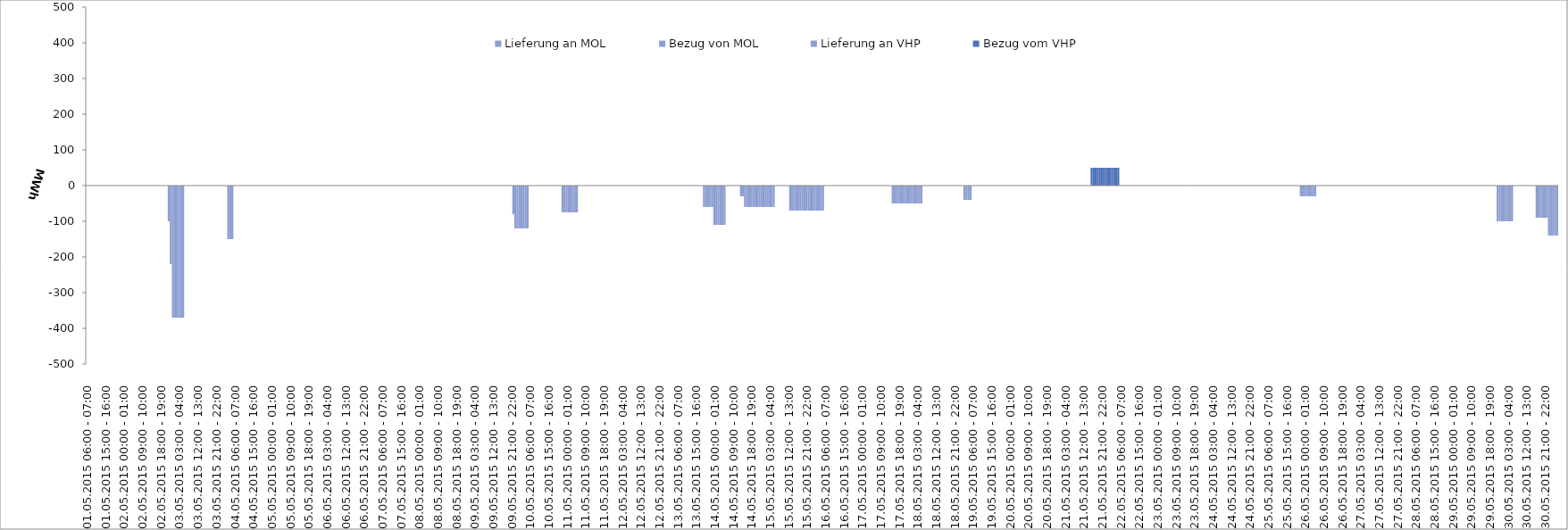
| Category | Bezug vom VHP | Lieferung an VHP | Bezug von MOL | Lieferung an MOL |
|---|---|---|---|---|
| 01.05.2015 06:00 - 07:00 | 0 | 0 | 0 | 0 |
| 01.05.2015 07:00 - 08:00 | 0 | 0 | 0 | 0 |
| 01.05.2015 08:00 - 09:00 | 0 | 0 | 0 | 0 |
| 01.05.2015 09:00 - 10:00 | 0 | 0 | 0 | 0 |
| 01.05.2015 10:00 - 11:00 | 0 | 0 | 0 | 0 |
| 01.05.2015 11:00 - 12:00 | 0 | 0 | 0 | 0 |
| 01.05.2015 12:00 - 13:00 | 0 | 0 | 0 | 0 |
| 01.05.2015 13:00 - 14:00 | 0 | 0 | 0 | 0 |
| 01.05.2015 14:00 - 15:00 | 0 | 0 | 0 | 0 |
| 01.05.2015 15:00 - 16:00 | 0 | 0 | 0 | 0 |
| 01.05.2015 16:00 - 17:00 | 0 | 0 | 0 | 0 |
| 01.05.2015 17:00 - 18:00 | 0 | 0 | 0 | 0 |
| 01.05.2015 18:00 - 19:00 | 0 | 0 | 0 | 0 |
| 01.05.2015 19:00 - 20:00 | 0 | 0 | 0 | 0 |
| 01.05.2015 20:00 - 21:00 | 0 | 0 | 0 | 0 |
| 01.05.2015 21:00 - 22:00 | 0 | 0 | 0 | 0 |
| 01.05.2015 22:00 - 23:00 | 0 | 0 | 0 | 0 |
| 01.05.2015 23:00 - 24:00 | 0 | 0 | 0 | 0 |
| 02.05.2015 00:00 - 01:00 | 0 | 0 | 0 | 0 |
| 02.05.2015 01:00 - 02:00 | 0 | 0 | 0 | 0 |
| 02.05.2015 02:00 - 03:00 | 0 | 0 | 0 | 0 |
| 02.05.2015 03:00 - 04:00 | 0 | 0 | 0 | 0 |
| 02.05.2015 04:00 - 05:00 | 0 | 0 | 0 | 0 |
| 02.05.2015 05:00 - 06:00 | 0 | 0 | 0 | 0 |
| 02.05.2015 06:00 - 07:00 | 0 | 0 | 0 | 0 |
| 02.05.2015 07:00 - 08:00 | 0 | 0 | 0 | 0 |
| 02.05.2015 08:00 - 09:00 | 0 | 0 | 0 | 0 |
| 02.05.2015 09:00 - 10:00 | 0 | 0 | 0 | 0 |
| 02.05.2015 10:00 - 11:00 | 0 | 0 | 0 | 0 |
| 02.05.2015 11:00 - 12:00 | 0 | 0 | 0 | 0 |
| 02.05.2015 12:00 - 13:00 | 0 | 0 | 0 | 0 |
| 02.05.2015 13:00 - 14:00 | 0 | 0 | 0 | 0 |
| 02.05.2015 14:00 - 15:00 | 0 | 0 | 0 | 0 |
| 02.05.2015 15:00 - 16:00 | 0 | 0 | 0 | 0 |
| 02.05.2015 16:00 - 17:00 | 0 | 0 | 0 | 0 |
| 02.05.2015 17:00 - 18:00 | 0 | 0 | 0 | 0 |
| 02.05.2015 18:00 - 19:00 | 0 | 0 | 0 | 0 |
| 02.05.2015 19:00 - 20:00 | 0 | 0 | 0 | 0 |
| 02.05.2015 20:00 - 21:00 | 0 | 0 | 0 | 0 |
| 02.05.2015 21:00 - 22:00 | 0 | 0 | 0 | 0 |
| 02.05.2015 22:00 - 23:00 | 0 | -100 | 0 | 0 |
| 02.05.2015 23:00 - 24:00 | 0 | -220 | 0 | 0 |
| 03.05.2015 00:00 - 01:00 | 0 | -370 | 0 | 0 |
| 03.05.2015 01:00 - 02:00 | 0 | -370 | 0 | 0 |
| 03.05.2015 02:00 - 03:00 | 0 | -370 | 0 | 0 |
| 03.05.2015 03:00 - 04:00 | 0 | -370 | 0 | 0 |
| 03.05.2015 04:00 - 05:00 | 0 | -370 | 0 | 0 |
| 03.05.2015 05:00 - 06:00 | 0 | -370 | 0 | 0 |
| 03.05.2015 06:00 - 07:00 | 0 | 0 | 0 | 0 |
| 03.05.2015 07:00 - 08:00 | 0 | 0 | 0 | 0 |
| 03.05.2015 08:00 - 09:00 | 0 | 0 | 0 | 0 |
| 03.05.2015 09:00 - 10:00 | 0 | 0 | 0 | 0 |
| 03.05.2015 10:00 - 11:00 | 0 | 0 | 0 | 0 |
| 03.05.2015 11:00 - 12:00 | 0 | 0 | 0 | 0 |
| 03.05.2015 12:00 - 13:00 | 0 | 0 | 0 | 0 |
| 03.05.2015 13:00 - 14:00 | 0 | 0 | 0 | 0 |
| 03.05.2015 14:00 - 15:00 | 0 | 0 | 0 | 0 |
| 03.05.2015 15:00 - 16:00 | 0 | 0 | 0 | 0 |
| 03.05.2015 16:00 - 17:00 | 0 | 0 | 0 | 0 |
| 03.05.2015 17:00 - 18:00 | 0 | 0 | 0 | 0 |
| 03.05.2015 18:00 - 19:00 | 0 | 0 | 0 | 0 |
| 03.05.2015 19:00 - 20:00 | 0 | 0 | 0 | 0 |
| 03.05.2015 20:00 - 21:00 | 0 | 0 | 0 | 0 |
| 03.05.2015 21:00 - 22:00 | 0 | 0 | 0 | 0 |
| 03.05.2015 22:00 - 23:00 | 0 | 0 | 0 | 0 |
| 03.05.2015 23:00 - 24:00 | 0 | 0 | 0 | 0 |
| 04.05.2015 00:00 - 01:00 | 0 | 0 | 0 | 0 |
| 04.05.2015 01:00 - 02:00 | 0 | 0 | 0 | 0 |
| 04.05.2015 02:00 - 03:00 | 0 | 0 | 0 | 0 |
| 04.05.2015 03:00 - 04:00 | 0 | -150 | 0 | 0 |
| 04.05.2015 04:00 - 05:00 | 0 | -150 | 0 | 0 |
| 04.05.2015 05:00 - 06:00 | 0 | -150 | 0 | 0 |
| 04.05.2015 06:00 - 07:00 | 0 | 0 | 0 | 0 |
| 04.05.2015 07:00 - 08:00 | 0 | 0 | 0 | 0 |
| 04.05.2015 08:00 - 09:00 | 0 | 0 | 0 | 0 |
| 04.05.2015 09:00 - 10:00 | 0 | 0 | 0 | 0 |
| 04.05.2015 10:00 - 11:00 | 0 | 0 | 0 | 0 |
| 04.05.2015 11:00 - 12:00 | 0 | 0 | 0 | 0 |
| 04.05.2015 12:00 - 13:00 | 0 | 0 | 0 | 0 |
| 04.05.2015 13:00 - 14:00 | 0 | 0 | 0 | 0 |
| 04.05.2015 14:00 - 15:00 | 0 | 0 | 0 | 0 |
| 04.05.2015 15:00 - 16:00 | 0 | 0 | 0 | 0 |
| 04.05.2015 16:00 - 17:00 | 0 | 0 | 0 | 0 |
| 04.05.2015 17:00 - 18:00 | 0 | 0 | 0 | 0 |
| 04.05.2015 18:00 - 19:00 | 0 | 0 | 0 | 0 |
| 04.05.2015 19:00 - 20:00 | 0 | 0 | 0 | 0 |
| 04.05.2015 20:00 - 21:00 | 0 | 0 | 0 | 0 |
| 04.05.2015 21:00 - 22:00 | 0 | 0 | 0 | 0 |
| 04.05.2015 22:00 - 23:00 | 0 | 0 | 0 | 0 |
| 04.05.2015 23:00 - 24:00 | 0 | 0 | 0 | 0 |
| 05.05.2015 00:00 - 01:00 | 0 | 0 | 0 | 0 |
| 05.05.2015 01:00 - 02:00 | 0 | 0 | 0 | 0 |
| 05.05.2015 02:00 - 03:00 | 0 | 0 | 0 | 0 |
| 05.05.2015 03:00 - 04:00 | 0 | 0 | 0 | 0 |
| 05.05.2015 04:00 - 05:00 | 0 | 0 | 0 | 0 |
| 05.05.2015 05:00 - 06:00 | 0 | 0 | 0 | 0 |
| 05.05.2015 06:00 - 07:00 | 0 | 0 | 0 | 0 |
| 05.05.2015 07:00 - 08:00 | 0 | 0 | 0 | 0 |
| 05.05.2015 08:00 - 09:00 | 0 | 0 | 0 | 0 |
| 05.05.2015 09:00 - 10:00 | 0 | 0 | 0 | 0 |
| 05.05.2015 10:00 - 11:00 | 0 | 0 | 0 | 0 |
| 05.05.2015 11:00 - 12:00 | 0 | 0 | 0 | 0 |
| 05.05.2015 12:00 - 13:00 | 0 | 0 | 0 | 0 |
| 05.05.2015 13:00 - 14:00 | 0 | 0 | 0 | 0 |
| 05.05.2015 14:00 - 15:00 | 0 | 0 | 0 | 0 |
| 05.05.2015 15:00 - 16:00 | 0 | 0 | 0 | 0 |
| 05.05.2015 16:00 - 17:00 | 0 | 0 | 0 | 0 |
| 05.05.2015 17:00 - 18:00 | 0 | 0 | 0 | 0 |
| 05.05.2015 18:00 - 19:00 | 0 | 0 | 0 | 0 |
| 05.05.2015 19:00 - 20:00 | 0 | 0 | 0 | 0 |
| 05.05.2015 20:00 - 21:00 | 0 | 0 | 0 | 0 |
| 05.05.2015 21:00 - 22:00 | 0 | 0 | 0 | 0 |
| 05.05.2015 22:00 - 23:00 | 0 | 0 | 0 | 0 |
| 05.05.2015 23:00 - 24:00 | 0 | 0 | 0 | 0 |
| 06.05.2015 00:00 - 01:00 | 0 | 0 | 0 | 0 |
| 06.05.2015 01:00 - 02:00 | 0 | 0 | 0 | 0 |
| 06.05.2015 02:00 - 03:00 | 0 | 0 | 0 | 0 |
| 06.05.2015 03:00 - 04:00 | 0 | 0 | 0 | 0 |
| 06.05.2015 04:00 - 05:00 | 0 | 0 | 0 | 0 |
| 06.05.2015 05:00 - 06:00 | 0 | 0 | 0 | 0 |
| 06.05.2015 06:00 - 07:00 | 0 | 0 | 0 | 0 |
| 06.05.2015 07:00 - 08:00 | 0 | 0 | 0 | 0 |
| 06.05.2015 08:00 - 09:00 | 0 | 0 | 0 | 0 |
| 06.05.2015 09:00 - 10:00 | 0 | 0 | 0 | 0 |
| 06.05.2015 10:00 - 11:00 | 0 | 0 | 0 | 0 |
| 06.05.2015 11:00 - 12:00 | 0 | 0 | 0 | 0 |
| 06.05.2015 12:00 - 13:00 | 0 | 0 | 0 | 0 |
| 06.05.2015 13:00 - 14:00 | 0 | 0 | 0 | 0 |
| 06.05.2015 14:00 - 15:00 | 0 | 0 | 0 | 0 |
| 06.05.2015 15:00 - 16:00 | 0 | 0 | 0 | 0 |
| 06.05.2015 16:00 - 17:00 | 0 | 0 | 0 | 0 |
| 06.05.2015 17:00 - 18:00 | 0 | 0 | 0 | 0 |
| 06.05.2015 18:00 - 19:00 | 0 | 0 | 0 | 0 |
| 06.05.2015 19:00 - 20:00 | 0 | 0 | 0 | 0 |
| 06.05.2015 20:00 - 21:00 | 0 | 0 | 0 | 0 |
| 06.05.2015 21:00 - 22:00 | 0 | 0 | 0 | 0 |
| 06.05.2015 22:00 - 23:00 | 0 | 0 | 0 | 0 |
| 06.05.2015 23:00 - 24:00 | 0 | 0 | 0 | 0 |
| 07.05.2015 00:00 - 01:00 | 0 | 0 | 0 | 0 |
| 07.05.2015 01:00 - 02:00 | 0 | 0 | 0 | 0 |
| 07.05.2015 02:00 - 03:00 | 0 | 0 | 0 | 0 |
| 07.05.2015 03:00 - 04:00 | 0 | 0 | 0 | 0 |
| 07.05.2015 04:00 - 05:00 | 0 | 0 | 0 | 0 |
| 07.05.2015 05:00 - 06:00 | 0 | 0 | 0 | 0 |
| 07.05.2015 06:00 - 07:00 | 0 | 0 | 0 | 0 |
| 07.05.2015 07:00 - 08:00 | 0 | 0 | 0 | 0 |
| 07.05.2015 08:00 - 09:00 | 0 | 0 | 0 | 0 |
| 07.05.2015 09:00 - 10:00 | 0 | 0 | 0 | 0 |
| 07.05.2015 10:00 - 11:00 | 0 | 0 | 0 | 0 |
| 07.05.2015 11:00 - 12:00 | 0 | 0 | 0 | 0 |
| 07.05.2015 12:00 - 13:00 | 0 | 0 | 0 | 0 |
| 07.05.2015 13:00 - 14:00 | 0 | 0 | 0 | 0 |
| 07.05.2015 14:00 - 15:00 | 0 | 0 | 0 | 0 |
| 07.05.2015 15:00 - 16:00 | 0 | 0 | 0 | 0 |
| 07.05.2015 16:00 - 17:00 | 0 | 0 | 0 | 0 |
| 07.05.2015 17:00 - 18:00 | 0 | 0 | 0 | 0 |
| 07.05.2015 18:00 - 19:00 | 0 | 0 | 0 | 0 |
| 07.05.2015 19:00 - 20:00 | 0 | 0 | 0 | 0 |
| 07.05.2015 20:00 - 21:00 | 0 | 0 | 0 | 0 |
| 07.05.2015 21:00 - 22:00 | 0 | 0 | 0 | 0 |
| 07.05.2015 22:00 - 23:00 | 0 | 0 | 0 | 0 |
| 07.05.2015 23:00 - 24:00 | 0 | 0 | 0 | 0 |
| 08.05.2015 00:00 - 01:00 | 0 | 0 | 0 | 0 |
| 08.05.2015 01:00 - 02:00 | 0 | 0 | 0 | 0 |
| 08.05.2015 02:00 - 03:00 | 0 | 0 | 0 | 0 |
| 08.05.2015 03:00 - 04:00 | 0 | 0 | 0 | 0 |
| 08.05.2015 04:00 - 05:00 | 0 | 0 | 0 | 0 |
| 08.05.2015 05:00 - 06:00 | 0 | 0 | 0 | 0 |
| 08.05.2015 06:00 - 07:00 | 0 | 0 | 0 | 0 |
| 08.05.2015 07:00 - 08:00 | 0 | 0 | 0 | 0 |
| 08.05.2015 08:00 - 09:00 | 0 | 0 | 0 | 0 |
| 08.05.2015 09:00 - 10:00 | 0 | 0 | 0 | 0 |
| 08.05.2015 10:00 - 11:00 | 0 | 0 | 0 | 0 |
| 08.05.2015 11:00 - 12:00 | 0 | 0 | 0 | 0 |
| 08.05.2015 12:00 - 13:00 | 0 | 0 | 0 | 0 |
| 08.05.2015 13:00 - 14:00 | 0 | 0 | 0 | 0 |
| 08.05.2015 14:00 - 15:00 | 0 | 0 | 0 | 0 |
| 08.05.2015 15:00 - 16:00 | 0 | 0 | 0 | 0 |
| 08.05.2015 16:00 - 17:00 | 0 | 0 | 0 | 0 |
| 08.05.2015 17:00 - 18:00 | 0 | 0 | 0 | 0 |
| 08.05.2015 18:00 - 19:00 | 0 | 0 | 0 | 0 |
| 08.05.2015 19:00 - 20:00 | 0 | 0 | 0 | 0 |
| 08.05.2015 20:00 - 21:00 | 0 | 0 | 0 | 0 |
| 08.05.2015 21:00 - 22:00 | 0 | 0 | 0 | 0 |
| 08.05.2015 22:00 - 23:00 | 0 | 0 | 0 | 0 |
| 08.05.2015 23:00 - 24:00 | 0 | 0 | 0 | 0 |
| 09.05.2015 00:00 - 01:00 | 0 | 0 | 0 | 0 |
| 09.05.2015 01:00 - 02:00 | 0 | 0 | 0 | 0 |
| 09.05.2015 02:00 - 03:00 | 0 | 0 | 0 | 0 |
| 09.05.2015 03:00 - 04:00 | 0 | 0 | 0 | 0 |
| 09.05.2015 04:00 - 05:00 | 0 | 0 | 0 | 0 |
| 09.05.2015 05:00 - 06:00 | 0 | 0 | 0 | 0 |
| 09.05.2015 06:00 - 07:00 | 0 | 0 | 0 | 0 |
| 09.05.2015 07:00 - 08:00 | 0 | 0 | 0 | 0 |
| 09.05.2015 08:00 - 09:00 | 0 | 0 | 0 | 0 |
| 09.05.2015 09:00 - 10:00 | 0 | 0 | 0 | 0 |
| 09.05.2015 10:00 - 11:00 | 0 | 0 | 0 | 0 |
| 09.05.2015 11:00 - 12:00 | 0 | 0 | 0 | 0 |
| 09.05.2015 12:00 - 13:00 | 0 | 0 | 0 | 0 |
| 09.05.2015 13:00 - 14:00 | 0 | 0 | 0 | 0 |
| 09.05.2015 14:00 - 15:00 | 0 | 0 | 0 | 0 |
| 09.05.2015 15:00 - 16:00 | 0 | 0 | 0 | 0 |
| 09.05.2015 16:00 - 17:00 | 0 | 0 | 0 | 0 |
| 09.05.2015 17:00 - 18:00 | 0 | 0 | 0 | 0 |
| 09.05.2015 18:00 - 19:00 | 0 | 0 | 0 | 0 |
| 09.05.2015 19:00 - 20:00 | 0 | 0 | 0 | 0 |
| 09.05.2015 20:00 - 21:00 | 0 | 0 | 0 | 0 |
| 09.05.2015 21:00 - 22:00 | 0 | 0 | 0 | 0 |
| 09.05.2015 22:00 - 23:00 | 0 | -80 | 0 | 0 |
| 09.05.2015 23:00 - 24:00 | 0 | -120 | 0 | 0 |
| 10.05.2015 00:00 - 01:00 | 0 | -120 | 0 | 0 |
| 10.05.2015 01:00 - 02:00 | 0 | -120 | 0 | 0 |
| 10.05.2015 02:00 - 03:00 | 0 | -120 | 0 | 0 |
| 10.05.2015 03:00 - 04:00 | 0 | -120 | 0 | 0 |
| 10.05.2015 04:00 - 05:00 | 0 | -120 | 0 | 0 |
| 10.05.2015 05:00 - 06:00 | 0 | -120 | 0 | 0 |
| 10.05.2015 06:00 - 07:00 | 0 | 0 | 0 | 0 |
| 10.05.2015 07:00 - 08:00 | 0 | 0 | 0 | 0 |
| 10.05.2015 08:00 - 09:00 | 0 | 0 | 0 | 0 |
| 10.05.2015 09:00 - 10:00 | 0 | 0 | 0 | 0 |
| 10.05.2015 10:00 - 11:00 | 0 | 0 | 0 | 0 |
| 10.05.2015 11:00 - 12:00 | 0 | 0 | 0 | 0 |
| 10.05.2015 12:00 - 13:00 | 0 | 0 | 0 | 0 |
| 10.05.2015 13:00 - 14:00 | 0 | 0 | 0 | 0 |
| 10.05.2015 14:00 - 15:00 | 0 | 0 | 0 | 0 |
| 10.05.2015 15:00 - 16:00 | 0 | 0 | 0 | 0 |
| 10.05.2015 16:00 - 17:00 | 0 | 0 | 0 | 0 |
| 10.05.2015 17:00 - 18:00 | 0 | 0 | 0 | 0 |
| 10.05.2015 18:00 - 19:00 | 0 | 0 | 0 | 0 |
| 10.05.2015 19:00 - 20:00 | 0 | 0 | 0 | 0 |
| 10.05.2015 20:00 - 21:00 | 0 | 0 | 0 | 0 |
| 10.05.2015 21:00 - 22:00 | 0 | 0 | 0 | 0 |
| 10.05.2015 22:00 - 23:00 | 0 | -75 | 0 | 0 |
| 10.05.2015 23:00 - 24:00 | 0 | -75 | 0 | 0 |
| 11.05.2015 00:00 - 01:00 | 0 | -75 | 0 | 0 |
| 11.05.2015 01:00 - 02:00 | 0 | -75 | 0 | 0 |
| 11.05.2015 02:00 - 03:00 | 0 | -75 | 0 | 0 |
| 11.05.2015 03:00 - 04:00 | 0 | -75 | 0 | 0 |
| 11.05.2015 04:00 - 05:00 | 0 | -75 | 0 | 0 |
| 11.05.2015 05:00 - 06:00 | 0 | -75 | 0 | 0 |
| 11.05.2015 06:00 - 07:00 | 0 | 0 | 0 | 0 |
| 11.05.2015 07:00 - 08:00 | 0 | 0 | 0 | 0 |
| 11.05.2015 08:00 - 09:00 | 0 | 0 | 0 | 0 |
| 11.05.2015 09:00 - 10:00 | 0 | 0 | 0 | 0 |
| 11.05.2015 10:00 - 11:00 | 0 | 0 | 0 | 0 |
| 11.05.2015 11:00 - 12:00 | 0 | 0 | 0 | 0 |
| 11.05.2015 12:00 - 13:00 | 0 | 0 | 0 | 0 |
| 11.05.2015 13:00 - 14:00 | 0 | 0 | 0 | 0 |
| 11.05.2015 14:00 - 15:00 | 0 | 0 | 0 | 0 |
| 11.05.2015 15:00 - 16:00 | 0 | 0 | 0 | 0 |
| 11.05.2015 16:00 - 17:00 | 0 | 0 | 0 | 0 |
| 11.05.2015 17:00 - 18:00 | 0 | 0 | 0 | 0 |
| 11.05.2015 18:00 - 19:00 | 0 | 0 | 0 | 0 |
| 11.05.2015 19:00 - 20:00 | 0 | 0 | 0 | 0 |
| 11.05.2015 20:00 - 21:00 | 0 | 0 | 0 | 0 |
| 11.05.2015 21:00 - 22:00 | 0 | 0 | 0 | 0 |
| 11.05.2015 22:00 - 23:00 | 0 | 0 | 0 | 0 |
| 11.05.2015 23:00 - 24:00 | 0 | 0 | 0 | 0 |
| 12.05.2015 00:00 - 01:00 | 0 | 0 | 0 | 0 |
| 12.05.2015 01:00 - 02:00 | 0 | 0 | 0 | 0 |
| 12.05.2015 02:00 - 03:00 | 0 | 0 | 0 | 0 |
| 12.05.2015 03:00 - 04:00 | 0 | 0 | 0 | 0 |
| 12.05.2015 04:00 - 05:00 | 0 | 0 | 0 | 0 |
| 12.05.2015 05:00 - 06:00 | 0 | 0 | 0 | 0 |
| 12.05.2015 06:00 - 07:00 | 0 | 0 | 0 | 0 |
| 12.05.2015 07:00 - 08:00 | 0 | 0 | 0 | 0 |
| 12.05.2015 08:00 - 09:00 | 0 | 0 | 0 | 0 |
| 12.05.2015 09:00 - 10:00 | 0 | 0 | 0 | 0 |
| 12.05.2015 10:00 - 11:00 | 0 | 0 | 0 | 0 |
| 12.05.2015 11:00 - 12:00 | 0 | 0 | 0 | 0 |
| 12.05.2015 12:00 - 13:00 | 0 | 0 | 0 | 0 |
| 12.05.2015 13:00 - 14:00 | 0 | 0 | 0 | 0 |
| 12.05.2015 14:00 - 15:00 | 0 | 0 | 0 | 0 |
| 12.05.2015 15:00 - 16:00 | 0 | 0 | 0 | 0 |
| 12.05.2015 16:00 - 17:00 | 0 | 0 | 0 | 0 |
| 12.05.2015 17:00 - 18:00 | 0 | 0 | 0 | 0 |
| 12.05.2015 18:00 - 19:00 | 0 | 0 | 0 | 0 |
| 12.05.2015 19:00 - 20:00 | 0 | 0 | 0 | 0 |
| 12.05.2015 20:00 - 21:00 | 0 | 0 | 0 | 0 |
| 12.05.2015 21:00 - 22:00 | 0 | 0 | 0 | 0 |
| 12.05.2015 22:00 - 23:00 | 0 | 0 | 0 | 0 |
| 12.05.2015 23:00 - 24:00 | 0 | 0 | 0 | 0 |
| 13.05.2015 00:00 - 01:00 | 0 | 0 | 0 | 0 |
| 13.05.2015 01:00 - 02:00 | 0 | 0 | 0 | 0 |
| 13.05.2015 02:00 - 03:00 | 0 | 0 | 0 | 0 |
| 13.05.2015 03:00 - 04:00 | 0 | 0 | 0 | 0 |
| 13.05.2015 04:00 - 05:00 | 0 | 0 | 0 | 0 |
| 13.05.2015 05:00 - 06:00 | 0 | 0 | 0 | 0 |
| 13.05.2015 06:00 - 07:00 | 0 | 0 | 0 | 0 |
| 13.05.2015 07:00 - 08:00 | 0 | 0 | 0 | 0 |
| 13.05.2015 08:00 - 09:00 | 0 | 0 | 0 | 0 |
| 13.05.2015 09:00 - 10:00 | 0 | 0 | 0 | 0 |
| 13.05.2015 10:00 - 11:00 | 0 | 0 | 0 | 0 |
| 13.05.2015 11:00 - 12:00 | 0 | 0 | 0 | 0 |
| 13.05.2015 12:00 - 13:00 | 0 | 0 | 0 | 0 |
| 13.05.2015 13:00 - 14:00 | 0 | 0 | 0 | 0 |
| 13.05.2015 14:00 - 15:00 | 0 | 0 | 0 | 0 |
| 13.05.2015 15:00 - 16:00 | 0 | 0 | 0 | 0 |
| 13.05.2015 16:00 - 17:00 | 0 | 0 | 0 | 0 |
| 13.05.2015 17:00 - 18:00 | 0 | 0 | 0 | 0 |
| 13.05.2015 18:00 - 19:00 | 0 | 0 | 0 | 0 |
| 13.05.2015 19:00 - 20:00 | 0 | -60 | 0 | 0 |
| 13.05.2015 20:00 - 21:00 | 0 | -60 | 0 | 0 |
| 13.05.2015 21:00 - 22:00 | 0 | -60 | 0 | 0 |
| 13.05.2015 22:00 - 23:00 | 0 | -60 | 0 | 0 |
| 13.05.2015 23:00 - 24:00 | 0 | -60 | 0 | 0 |
| 14.05.2015 00:00 - 01:00 | 0 | -110 | 0 | 0 |
| 14.05.2015 01:00 - 02:00 | 0 | -110 | 0 | 0 |
| 14.05.2015 02:00 - 03:00 | 0 | -110 | 0 | 0 |
| 14.05.2015 03:00 - 04:00 | 0 | -110 | 0 | 0 |
| 14.05.2015 04:00 - 05:00 | 0 | -110 | 0 | 0 |
| 14.05.2015 05:00 - 06:00 | 0 | -110 | 0 | 0 |
| 14.05.2015 06:00 - 07:00 | 0 | 0 | 0 | 0 |
| 14.05.2015 07:00 - 08:00 | 0 | 0 | 0 | 0 |
| 14.05.2015 08:00 - 09:00 | 0 | 0 | 0 | 0 |
| 14.05.2015 09:00 - 10:00 | 0 | 0 | 0 | 0 |
| 14.05.2015 10:00 - 11:00 | 0 | 0 | 0 | 0 |
| 14.05.2015 11:00 - 12:00 | 0 | 0 | 0 | 0 |
| 14.05.2015 12:00 - 13:00 | 0 | 0 | 0 | 0 |
| 14.05.2015 13:00 - 14:00 | 0 | -30 | 0 | 0 |
| 14.05.2015 14:00 - 15:00 | 0 | -30 | 0 | 0 |
| 14.05.2015 15:00 - 16:00 | 0 | -60 | 0 | 0 |
| 14.05.2015 16:00 - 17:00 | 0 | -60 | 0 | 0 |
| 14.05.2015 17:00 - 18:00 | 0 | -60 | 0 | 0 |
| 14.05.2015 18:00 - 19:00 | 0 | -60 | 0 | 0 |
| 14.05.2015 19:00 - 20:00 | 0 | -60 | 0 | 0 |
| 14.05.2015 20:00 - 21:00 | 0 | -60 | 0 | 0 |
| 14.05.2015 21:00 - 22:00 | 0 | -60 | 0 | 0 |
| 14.05.2015 22:00 - 23:00 | 0 | -60 | 0 | 0 |
| 14.05.2015 23:00 - 24:00 | 0 | -60 | 0 | 0 |
| 15.05.2015 00:00 - 01:00 | 0 | -60 | 0 | 0 |
| 15.05.2015 01:00 - 02:00 | 0 | -60 | 0 | 0 |
| 15.05.2015 02:00 - 03:00 | 0 | -60 | 0 | 0 |
| 15.05.2015 03:00 - 04:00 | 0 | -60 | 0 | 0 |
| 15.05.2015 04:00 - 05:00 | 0 | -60 | 0 | 0 |
| 15.05.2015 05:00 - 06:00 | 0 | -60 | 0 | 0 |
| 15.05.2015 06:00 - 07:00 | 0 | 0 | 0 | 0 |
| 15.05.2015 07:00 - 08:00 | 0 | 0 | 0 | 0 |
| 15.05.2015 08:00 - 09:00 | 0 | 0 | 0 | 0 |
| 15.05.2015 09:00 - 10:00 | 0 | 0 | 0 | 0 |
| 15.05.2015 10:00 - 11:00 | 0 | 0 | 0 | 0 |
| 15.05.2015 11:00 - 12:00 | 0 | 0 | 0 | 0 |
| 15.05.2015 12:00 - 13:00 | 0 | 0 | 0 | 0 |
| 15.05.2015 13:00 - 14:00 | 0 | -70 | 0 | 0 |
| 15.05.2015 14:00 - 15:00 | 0 | -70 | 0 | 0 |
| 15.05.2015 15:00 - 16:00 | 0 | -70 | 0 | 0 |
| 15.05.2015 16:00 - 17:00 | 0 | -70 | 0 | 0 |
| 15.05.2015 17:00 - 18:00 | 0 | -70 | 0 | 0 |
| 15.05.2015 18:00 - 19:00 | 0 | -70 | 0 | 0 |
| 15.05.2015 19:00 - 20:00 | 0 | -70 | 0 | 0 |
| 15.05.2015 20:00 - 21:00 | 0 | -70 | 0 | 0 |
| 15.05.2015 21:00 - 22:00 | 0 | -70 | 0 | 0 |
| 15.05.2015 22:00 - 23:00 | 0 | -70 | 0 | 0 |
| 15.05.2015 23:00 - 24:00 | 0 | -70 | 0 | 0 |
| 16.05.2015 00:00 - 01:00 | 0 | -70 | 0 | 0 |
| 16.05.2015 01:00 - 02:00 | 0 | -70 | 0 | 0 |
| 16.05.2015 02:00 - 03:00 | 0 | -70 | 0 | 0 |
| 16.05.2015 03:00 - 04:00 | 0 | -70 | 0 | 0 |
| 16.05.2015 04:00 - 05:00 | 0 | -70 | 0 | 0 |
| 16.05.2015 05:00 - 06:00 | 0 | -70 | 0 | 0 |
| 16.05.2015 06:00 - 07:00 | 0 | 0 | 0 | 0 |
| 16.05.2015 07:00 - 08:00 | 0 | 0 | 0 | 0 |
| 16.05.2015 08:00 - 09:00 | 0 | 0 | 0 | 0 |
| 16.05.2015 09:00 - 10:00 | 0 | 0 | 0 | 0 |
| 16.05.2015 10:00 - 11:00 | 0 | 0 | 0 | 0 |
| 16.05.2015 11:00 - 12:00 | 0 | 0 | 0 | 0 |
| 16.05.2015 12:00 - 13:00 | 0 | 0 | 0 | 0 |
| 16.05.2015 13:00 - 14:00 | 0 | 0 | 0 | 0 |
| 16.05.2015 14:00 - 15:00 | 0 | 0 | 0 | 0 |
| 16.05.2015 15:00 - 16:00 | 0 | 0 | 0 | 0 |
| 16.05.2015 16:00 - 17:00 | 0 | 0 | 0 | 0 |
| 16.05.2015 17:00 - 18:00 | 0 | 0 | 0 | 0 |
| 16.05.2015 18:00 - 19:00 | 0 | 0 | 0 | 0 |
| 16.05.2015 19:00 - 20:00 | 0 | 0 | 0 | 0 |
| 16.05.2015 20:00 - 21:00 | 0 | 0 | 0 | 0 |
| 16.05.2015 21:00 - 22:00 | 0 | 0 | 0 | 0 |
| 16.05.2015 22:00 - 23:00 | 0 | 0 | 0 | 0 |
| 16.05.2015 23:00 - 24:00 | 0 | 0 | 0 | 0 |
| 17.05.2015 00:00 - 01:00 | 0 | 0 | 0 | 0 |
| 17.05.2015 01:00 - 02:00 | 0 | 0 | 0 | 0 |
| 17.05.2015 02:00 - 03:00 | 0 | 0 | 0 | 0 |
| 17.05.2015 03:00 - 04:00 | 0 | 0 | 0 | 0 |
| 17.05.2015 04:00 - 05:00 | 0 | 0 | 0 | 0 |
| 17.05.2015 05:00 - 06:00 | 0 | 0 | 0 | 0 |
| 17.05.2015 06:00 - 07:00 | 0 | 0 | 0 | 0 |
| 17.05.2015 07:00 - 08:00 | 0 | 0 | 0 | 0 |
| 17.05.2015 08:00 - 09:00 | 0 | 0 | 0 | 0 |
| 17.05.2015 09:00 - 10:00 | 0 | 0 | 0 | 0 |
| 17.05.2015 10:00 - 11:00 | 0 | 0 | 0 | 0 |
| 17.05.2015 11:00 - 12:00 | 0 | 0 | 0 | 0 |
| 17.05.2015 12:00 - 13:00 | 0 | 0 | 0 | 0 |
| 17.05.2015 13:00 - 14:00 | 0 | 0 | 0 | 0 |
| 17.05.2015 14:00 - 15:00 | 0 | 0 | 0 | 0 |
| 17.05.2015 15:00 - 16:00 | 0 | -50 | 0 | 0 |
| 17.05.2015 16:00 - 17:00 | 0 | -50 | 0 | 0 |
| 17.05.2015 17:00 - 18:00 | 0 | -50 | 0 | 0 |
| 17.05.2015 18:00 - 19:00 | 0 | -50 | 0 | 0 |
| 17.05.2015 19:00 - 20:00 | 0 | -50 | 0 | 0 |
| 17.05.2015 20:00 - 21:00 | 0 | -50 | 0 | 0 |
| 17.05.2015 21:00 - 22:00 | 0 | -50 | 0 | 0 |
| 17.05.2015 22:00 - 23:00 | 0 | -50 | 0 | 0 |
| 17.05.2015 23:00 - 24:00 | 0 | -50 | 0 | 0 |
| 18.05.2015 00:00 - 01:00 | 0 | -50 | 0 | 0 |
| 18.05.2015 01:00 - 02:00 | 0 | -50 | 0 | 0 |
| 18.05.2015 02:00 - 03:00 | 0 | -50 | 0 | 0 |
| 18.05.2015 03:00 - 04:00 | 0 | -50 | 0 | 0 |
| 18.05.2015 04:00 - 05:00 | 0 | -50 | 0 | 0 |
| 18.05.2015 05:00 - 06:00 | 0 | -50 | 0 | 0 |
| 18.05.2015 06:00 - 07:00 | 0 | 0 | 0 | 0 |
| 18.05.2015 07:00 - 08:00 | 0 | 0 | 0 | 0 |
| 18.05.2015 08:00 - 09:00 | 0 | 0 | 0 | 0 |
| 18.05.2015 09:00 - 10:00 | 0 | 0 | 0 | 0 |
| 18.05.2015 10:00 - 11:00 | 0 | 0 | 0 | 0 |
| 18.05.2015 11:00 - 12:00 | 0 | 0 | 0 | 0 |
| 18.05.2015 12:00 - 13:00 | 0 | 0 | 0 | 0 |
| 18.05.2015 13:00 - 14:00 | 0 | 0 | 0 | 0 |
| 18.05.2015 14:00 - 15:00 | 0 | 0 | 0 | 0 |
| 18.05.2015 15:00 - 16:00 | 0 | 0 | 0 | 0 |
| 18.05.2015 16:00 - 17:00 | 0 | 0 | 0 | 0 |
| 18.05.2015 17:00 - 18:00 | 0 | 0 | 0 | 0 |
| 18.05.2015 18:00 - 19:00 | 0 | 0 | 0 | 0 |
| 18.05.2015 19:00 - 20:00 | 0 | 0 | 0 | 0 |
| 18.05.2015 20:00 - 21:00 | 0 | 0 | 0 | 0 |
| 18.05.2015 21:00 - 22:00 | 0 | 0 | 0 | 0 |
| 18.05.2015 22:00 - 23:00 | 0 | 0 | 0 | 0 |
| 18.05.2015 23:00 - 24:00 | 0 | 0 | 0 | 0 |
| 19.05.2015 00:00 - 01:00 | 0 | 0 | 0 | 0 |
| 19.05.2015 01:00 - 02:00 | 0 | 0 | 0 | 0 |
| 19.05.2015 02:00 - 03:00 | 0 | -40 | 0 | 0 |
| 19.05.2015 03:00 - 04:00 | 0 | -40 | 0 | 0 |
| 19.05.2015 04:00 - 05:00 | 0 | -40 | 0 | 0 |
| 19.05.2015 05:00 - 06:00 | 0 | -40 | 0 | 0 |
| 19.05.2015 06:00 - 07:00 | 0 | 0 | 0 | 0 |
| 19.05.2015 07:00 - 08:00 | 0 | 0 | 0 | 0 |
| 19.05.2015 08:00 - 09:00 | 0 | 0 | 0 | 0 |
| 19.05.2015 09:00 - 10:00 | 0 | 0 | 0 | 0 |
| 19.05.2015 10:00 - 11:00 | 0 | 0 | 0 | 0 |
| 19.05.2015 11:00 - 12:00 | 0 | 0 | 0 | 0 |
| 19.05.2015 12:00 - 13:00 | 0 | 0 | 0 | 0 |
| 19.05.2015 13:00 - 14:00 | 0 | 0 | 0 | 0 |
| 19.05.2015 14:00 - 15:00 | 0 | 0 | 0 | 0 |
| 19.05.2015 15:00 - 16:00 | 0 | 0 | 0 | 0 |
| 19.05.2015 16:00 - 17:00 | 0 | 0 | 0 | 0 |
| 19.05.2015 17:00 - 18:00 | 0 | 0 | 0 | 0 |
| 19.05.2015 18:00 - 19:00 | 0 | 0 | 0 | 0 |
| 19.05.2015 19:00 - 20:00 | 0 | 0 | 0 | 0 |
| 19.05.2015 20:00 - 21:00 | 0 | 0 | 0 | 0 |
| 19.05.2015 21:00 - 22:00 | 0 | 0 | 0 | 0 |
| 19.05.2015 22:00 - 23:00 | 0 | 0 | 0 | 0 |
| 19.05.2015 23:00 - 24:00 | 0 | 0 | 0 | 0 |
| 20.05.2015 00:00 - 01:00 | 0 | 0 | 0 | 0 |
| 20.05.2015 01:00 - 02:00 | 0 | 0 | 0 | 0 |
| 20.05.2015 02:00 - 03:00 | 0 | 0 | 0 | 0 |
| 20.05.2015 03:00 - 04:00 | 0 | 0 | 0 | 0 |
| 20.05.2015 04:00 - 05:00 | 0 | 0 | 0 | 0 |
| 20.05.2015 05:00 - 06:00 | 0 | 0 | 0 | 0 |
| 20.05.2015 06:00 - 07:00 | 0 | 0 | 0 | 0 |
| 20.05.2015 07:00 - 08:00 | 0 | 0 | 0 | 0 |
| 20.05.2015 08:00 - 09:00 | 0 | 0 | 0 | 0 |
| 20.05.2015 09:00 - 10:00 | 0 | 0 | 0 | 0 |
| 20.05.2015 10:00 - 11:00 | 0 | 0 | 0 | 0 |
| 20.05.2015 11:00 - 12:00 | 0 | 0 | 0 | 0 |
| 20.05.2015 12:00 - 13:00 | 0 | 0 | 0 | 0 |
| 20.05.2015 13:00 - 14:00 | 0 | 0 | 0 | 0 |
| 20.05.2015 14:00 - 15:00 | 0 | 0 | 0 | 0 |
| 20.05.2015 15:00 - 16:00 | 0 | 0 | 0 | 0 |
| 20.05.2015 16:00 - 17:00 | 0 | 0 | 0 | 0 |
| 20.05.2015 17:00 - 18:00 | 0 | 0 | 0 | 0 |
| 20.05.2015 18:00 - 19:00 | 0 | 0 | 0 | 0 |
| 20.05.2015 19:00 - 20:00 | 0 | 0 | 0 | 0 |
| 20.05.2015 20:00 - 21:00 | 0 | 0 | 0 | 0 |
| 20.05.2015 21:00 - 22:00 | 0 | 0 | 0 | 0 |
| 20.05.2015 22:00 - 23:00 | 0 | 0 | 0 | 0 |
| 20.05.2015 23:00 - 24:00 | 0 | 0 | 0 | 0 |
| 21.05.2015 00:00 - 01:00 | 0 | 0 | 0 | 0 |
| 21.05.2015 01:00 - 02:00 | 0 | 0 | 0 | 0 |
| 21.05.2015 02:00 - 03:00 | 0 | 0 | 0 | 0 |
| 21.05.2015 03:00 - 04:00 | 0 | 0 | 0 | 0 |
| 21.05.2015 04:00 - 05:00 | 0 | 0 | 0 | 0 |
| 21.05.2015 05:00 - 06:00 | 0 | 0 | 0 | 0 |
| 21.05.2015 06:00 - 07:00 | 0 | 0 | 0 | 0 |
| 21.05.2015 07:00 - 08:00 | 0 | 0 | 0 | 0 |
| 21.05.2015 08:00 - 09:00 | 0 | 0 | 0 | 0 |
| 21.05.2015 09:00 - 10:00 | 0 | 0 | 0 | 0 |
| 21.05.2015 10:00 - 11:00 | 0 | 0 | 0 | 0 |
| 21.05.2015 11:00 - 12:00 | 0 | 0 | 0 | 0 |
| 21.05.2015 12:00 - 13:00 | 0 | 0 | 0 | 0 |
| 21.05.2015 13:00 - 14:00 | 0 | 0 | 0 | 0 |
| 21.05.2015 14:00 - 15:00 | 0 | 0 | 0 | 0 |
| 21.05.2015 15:00 - 16:00 | 0 | 0 | 0 | 0 |
| 21.05.2015 16:00 - 17:00 | 50 | 0 | 0 | 0 |
| 21.05.2015 17:00 - 18:00 | 50 | 0 | 0 | 0 |
| 21.05.2015 18:00 - 19:00 | 50 | 0 | 0 | 0 |
| 21.05.2015 19:00 - 20:00 | 50 | 0 | 0 | 0 |
| 21.05.2015 20:00 - 21:00 | 50 | 0 | 0 | 0 |
| 21.05.2015 21:00 - 22:00 | 50 | 0 | 0 | 0 |
| 21.05.2015 22:00 - 23:00 | 50 | 0 | 0 | 0 |
| 21.05.2015 23:00 - 24:00 | 50 | 0 | 0 | 0 |
| 22.05.2015 00:00 - 01:00 | 50 | 0 | 0 | 0 |
| 22.05.2015 01:00 - 02:00 | 50 | 0 | 0 | 0 |
| 22.05.2015 02:00 - 03:00 | 50 | 0 | 0 | 0 |
| 22.05.2015 03:00 - 04:00 | 50 | 0 | 0 | 0 |
| 22.05.2015 04:00 - 05:00 | 50 | 0 | 0 | 0 |
| 22.05.2015 05:00 - 06:00 | 50 | 0 | 0 | 0 |
| 22.05.2015 06:00 - 07:00 | 0 | 0 | 0 | 0 |
| 22.05.2015 07:00 - 08:00 | 0 | 0 | 0 | 0 |
| 22.05.2015 08:00 - 09:00 | 0 | 0 | 0 | 0 |
| 22.05.2015 09:00 - 10:00 | 0 | 0 | 0 | 0 |
| 22.05.2015 10:00 - 11:00 | 0 | 0 | 0 | 0 |
| 22.05.2015 11:00 - 12:00 | 0 | 0 | 0 | 0 |
| 22.05.2015 12:00 - 13:00 | 0 | 0 | 0 | 0 |
| 22.05.2015 13:00 - 14:00 | 0 | 0 | 0 | 0 |
| 22.05.2015 14:00 - 15:00 | 0 | 0 | 0 | 0 |
| 22.05.2015 15:00 - 16:00 | 0 | 0 | 0 | 0 |
| 22.05.2015 16:00 - 17:00 | 0 | 0 | 0 | 0 |
| 22.05.2015 17:00 - 18:00 | 0 | 0 | 0 | 0 |
| 22.05.2015 18:00 - 19:00 | 0 | 0 | 0 | 0 |
| 22.05.2015 19:00 - 20:00 | 0 | 0 | 0 | 0 |
| 22.05.2015 20:00 - 21:00 | 0 | 0 | 0 | 0 |
| 22.05.2015 21:00 - 22:00 | 0 | 0 | 0 | 0 |
| 22.05.2015 22:00 - 23:00 | 0 | 0 | 0 | 0 |
| 22.05.2015 23:00 - 24:00 | 0 | 0 | 0 | 0 |
| 23.05.2015 00:00 - 01:00 | 0 | 0 | 0 | 0 |
| 23.05.2015 01:00 - 02:00 | 0 | 0 | 0 | 0 |
| 23.05.2015 02:00 - 03:00 | 0 | 0 | 0 | 0 |
| 23.05.2015 03:00 - 04:00 | 0 | 0 | 0 | 0 |
| 23.05.2015 04:00 - 05:00 | 0 | 0 | 0 | 0 |
| 23.05.2015 05:00 - 06:00 | 0 | 0 | 0 | 0 |
| 23.05.2015 06:00 - 07:00 | 0 | 0 | 0 | 0 |
| 23.05.2015 07:00 - 08:00 | 0 | 0 | 0 | 0 |
| 23.05.2015 08:00 - 09:00 | 0 | 0 | 0 | 0 |
| 23.05.2015 09:00 - 10:00 | 0 | 0 | 0 | 0 |
| 23.05.2015 10:00 - 11:00 | 0 | 0 | 0 | 0 |
| 23.05.2015 11:00 - 12:00 | 0 | 0 | 0 | 0 |
| 23.05.2015 12:00 - 13:00 | 0 | 0 | 0 | 0 |
| 23.05.2015 13:00 - 14:00 | 0 | 0 | 0 | 0 |
| 23.05.2015 14:00 - 15:00 | 0 | 0 | 0 | 0 |
| 23.05.2015 15:00 - 16:00 | 0 | 0 | 0 | 0 |
| 23.05.2015 16:00 - 17:00 | 0 | 0 | 0 | 0 |
| 23.05.2015 17:00 - 18:00 | 0 | 0 | 0 | 0 |
| 23.05.2015 18:00 - 19:00 | 0 | 0 | 0 | 0 |
| 23.05.2015 19:00 - 20:00 | 0 | 0 | 0 | 0 |
| 23.05.2015 20:00 - 21:00 | 0 | 0 | 0 | 0 |
| 23.05.2015 21:00 - 22:00 | 0 | 0 | 0 | 0 |
| 23.05.2015 22:00 - 23:00 | 0 | 0 | 0 | 0 |
| 23.05.2015 23:00 - 24:00 | 0 | 0 | 0 | 0 |
| 24.05.2015 00:00 - 01:00 | 0 | 0 | 0 | 0 |
| 24.05.2015 01:00 - 02:00 | 0 | 0 | 0 | 0 |
| 24.05.2015 02:00 - 03:00 | 0 | 0 | 0 | 0 |
| 24.05.2015 03:00 - 04:00 | 0 | 0 | 0 | 0 |
| 24.05.2015 04:00 - 05:00 | 0 | 0 | 0 | 0 |
| 24.05.2015 05:00 - 06:00 | 0 | 0 | 0 | 0 |
| 24.05.2015 06:00 - 07:00 | 0 | 0 | 0 | 0 |
| 24.05.2015 07:00 - 08:00 | 0 | 0 | 0 | 0 |
| 24.05.2015 08:00 - 09:00 | 0 | 0 | 0 | 0 |
| 24.05.2015 09:00 - 10:00 | 0 | 0 | 0 | 0 |
| 24.05.2015 10:00 - 11:00 | 0 | 0 | 0 | 0 |
| 24.05.2015 11:00 - 12:00 | 0 | 0 | 0 | 0 |
| 24.05.2015 12:00 - 13:00 | 0 | 0 | 0 | 0 |
| 24.05.2015 13:00 - 14:00 | 0 | 0 | 0 | 0 |
| 24.05.2015 14:00 - 15:00 | 0 | 0 | 0 | 0 |
| 24.05.2015 15:00 - 16:00 | 0 | 0 | 0 | 0 |
| 24.05.2015 16:00 - 17:00 | 0 | 0 | 0 | 0 |
| 24.05.2015 17:00 - 18:00 | 0 | 0 | 0 | 0 |
| 24.05.2015 18:00 - 19:00 | 0 | 0 | 0 | 0 |
| 24.05.2015 19:00 - 20:00 | 0 | 0 | 0 | 0 |
| 24.05.2015 20:00 - 21:00 | 0 | 0 | 0 | 0 |
| 24.05.2015 21:00 - 22:00 | 0 | 0 | 0 | 0 |
| 24.05.2015 22:00 - 23:00 | 0 | 0 | 0 | 0 |
| 24.05.2015 23:00 - 24:00 | 0 | 0 | 0 | 0 |
| 25.05.2015 00:00 - 01:00 | 0 | 0 | 0 | 0 |
| 25.05.2015 01:00 - 02:00 | 0 | 0 | 0 | 0 |
| 25.05.2015 02:00 - 03:00 | 0 | 0 | 0 | 0 |
| 25.05.2015 03:00 - 04:00 | 0 | 0 | 0 | 0 |
| 25.05.2015 04:00 - 05:00 | 0 | 0 | 0 | 0 |
| 25.05.2015 05:00 - 06:00 | 0 | 0 | 0 | 0 |
| 25.05.2015 06:00 - 07:00 | 0 | 0 | 0 | 0 |
| 25.05.2015 07:00 - 08:00 | 0 | 0 | 0 | 0 |
| 25.05.2015 08:00 - 09:00 | 0 | 0 | 0 | 0 |
| 25.05.2015 09:00 - 10:00 | 0 | 0 | 0 | 0 |
| 25.05.2015 10:00 - 11:00 | 0 | 0 | 0 | 0 |
| 25.05.2015 11:00 - 12:00 | 0 | 0 | 0 | 0 |
| 25.05.2015 12:00 - 13:00 | 0 | 0 | 0 | 0 |
| 25.05.2015 13:00 - 14:00 | 0 | 0 | 0 | 0 |
| 25.05.2015 14:00 - 15:00 | 0 | 0 | 0 | 0 |
| 25.05.2015 15:00 - 16:00 | 0 | 0 | 0 | 0 |
| 25.05.2015 16:00 - 17:00 | 0 | 0 | 0 | 0 |
| 25.05.2015 17:00 - 18:00 | 0 | 0 | 0 | 0 |
| 25.05.2015 18:00 - 19:00 | 0 | 0 | 0 | 0 |
| 25.05.2015 19:00 - 20:00 | 0 | 0 | 0 | 0 |
| 25.05.2015 20:00 - 21:00 | 0 | 0 | 0 | 0 |
| 25.05.2015 21:00 - 22:00 | 0 | 0 | 0 | 0 |
| 25.05.2015 22:00 - 23:00 | 0 | -30 | 0 | 0 |
| 25.05.2015 23:00 - 24:00 | 0 | -30 | 0 | 0 |
| 26.05.2015 00:00 - 01:00 | 0 | -30 | 0 | 0 |
| 26.05.2015 01:00 - 02:00 | 0 | -30 | 0 | 0 |
| 26.05.2015 02:00 - 03:00 | 0 | -30 | 0 | 0 |
| 26.05.2015 03:00 - 04:00 | 0 | -30 | 0 | 0 |
| 26.05.2015 04:00 - 05:00 | 0 | -30 | 0 | 0 |
| 26.05.2015 05:00 - 06:00 | 0 | -30 | 0 | 0 |
| 26.05.2015 06:00 - 07:00 | 0 | 0 | 0 | 0 |
| 26.05.2015 07:00 - 08:00 | 0 | 0 | 0 | 0 |
| 26.05.2015 08:00 - 09:00 | 0 | 0 | 0 | 0 |
| 26.05.2015 09:00 - 10:00 | 0 | 0 | 0 | 0 |
| 26.05.2015 10:00 - 11:00 | 0 | 0 | 0 | 0 |
| 26.05.2015 11:00 - 12:00 | 0 | 0 | 0 | 0 |
| 26.05.2015 12:00 - 13:00 | 0 | 0 | 0 | 0 |
| 26.05.2015 13:00 - 14:00 | 0 | 0 | 0 | 0 |
| 26.05.2015 14:00 - 15:00 | 0 | 0 | 0 | 0 |
| 26.05.2015 15:00 - 16:00 | 0 | 0 | 0 | 0 |
| 26.05.2015 16:00 - 17:00 | 0 | 0 | 0 | 0 |
| 26.05.2015 17:00 - 18:00 | 0 | 0 | 0 | 0 |
| 26.05.2015 18:00 - 19:00 | 0 | 0 | 0 | 0 |
| 26.05.2015 19:00 - 20:00 | 0 | 0 | 0 | 0 |
| 26.05.2015 20:00 - 21:00 | 0 | 0 | 0 | 0 |
| 26.05.2015 21:00 - 22:00 | 0 | 0 | 0 | 0 |
| 26.05.2015 22:00 - 23:00 | 0 | 0 | 0 | 0 |
| 26.05.2015 23:00 - 24:00 | 0 | 0 | 0 | 0 |
| 27.05.2015 00:00 - 01:00 | 0 | 0 | 0 | 0 |
| 27.05.2015 01:00 - 02:00 | 0 | 0 | 0 | 0 |
| 27.05.2015 02:00 - 03:00 | 0 | 0 | 0 | 0 |
| 27.05.2015 03:00 - 04:00 | 0 | 0 | 0 | 0 |
| 27.05.2015 04:00 - 05:00 | 0 | 0 | 0 | 0 |
| 27.05.2015 05:00 - 06:00 | 0 | 0 | 0 | 0 |
| 27.05.2015 06:00 - 07:00 | 0 | 0 | 0 | 0 |
| 27.05.2015 07:00 - 08:00 | 0 | 0 | 0 | 0 |
| 27.05.2015 08:00 - 09:00 | 0 | 0 | 0 | 0 |
| 27.05.2015 09:00 - 10:00 | 0 | 0 | 0 | 0 |
| 27.05.2015 10:00 - 11:00 | 0 | 0 | 0 | 0 |
| 27.05.2015 11:00 - 12:00 | 0 | 0 | 0 | 0 |
| 27.05.2015 12:00 - 13:00 | 0 | 0 | 0 | 0 |
| 27.05.2015 13:00 - 14:00 | 0 | 0 | 0 | 0 |
| 27.05.2015 14:00 - 15:00 | 0 | 0 | 0 | 0 |
| 27.05.2015 15:00 - 16:00 | 0 | 0 | 0 | 0 |
| 27.05.2015 16:00 - 17:00 | 0 | 0 | 0 | 0 |
| 27.05.2015 17:00 - 18:00 | 0 | 0 | 0 | 0 |
| 27.05.2015 18:00 - 19:00 | 0 | 0 | 0 | 0 |
| 27.05.2015 19:00 - 20:00 | 0 | 0 | 0 | 0 |
| 27.05.2015 20:00 - 21:00 | 0 | 0 | 0 | 0 |
| 27.05.2015 21:00 - 22:00 | 0 | 0 | 0 | 0 |
| 27.05.2015 22:00 - 23:00 | 0 | 0 | 0 | 0 |
| 27.05.2015 23:00 - 24:00 | 0 | 0 | 0 | 0 |
| 28.05.2015 00:00 - 01:00 | 0 | 0 | 0 | 0 |
| 28.05.2015 01:00 - 02:00 | 0 | 0 | 0 | 0 |
| 28.05.2015 02:00 - 03:00 | 0 | 0 | 0 | 0 |
| 28.05.2015 03:00 - 04:00 | 0 | 0 | 0 | 0 |
| 28.05.2015 04:00 - 05:00 | 0 | 0 | 0 | 0 |
| 28.05.2015 05:00 - 06:00 | 0 | 0 | 0 | 0 |
| 28.05.2015 06:00 - 07:00 | 0 | 0 | 0 | 0 |
| 28.05.2015 07:00 - 08:00 | 0 | 0 | 0 | 0 |
| 28.05.2015 08:00 - 09:00 | 0 | 0 | 0 | 0 |
| 28.05.2015 09:00 - 10:00 | 0 | 0 | 0 | 0 |
| 28.05.2015 10:00 - 11:00 | 0 | 0 | 0 | 0 |
| 28.05.2015 11:00 - 12:00 | 0 | 0 | 0 | 0 |
| 28.05.2015 12:00 - 13:00 | 0 | 0 | 0 | 0 |
| 28.05.2015 13:00 - 14:00 | 0 | 0 | 0 | 0 |
| 28.05.2015 14:00 - 15:00 | 0 | 0 | 0 | 0 |
| 28.05.2015 15:00 - 16:00 | 0 | 0 | 0 | 0 |
| 28.05.2015 16:00 - 17:00 | 0 | 0 | 0 | 0 |
| 28.05.2015 17:00 - 18:00 | 0 | 0 | 0 | 0 |
| 28.05.2015 18:00 - 19:00 | 0 | 0 | 0 | 0 |
| 28.05.2015 19:00 - 20:00 | 0 | 0 | 0 | 0 |
| 28.05.2015 20:00 - 21:00 | 0 | 0 | 0 | 0 |
| 28.05.2015 21:00 - 22:00 | 0 | 0 | 0 | 0 |
| 28.05.2015 22:00 - 23:00 | 0 | 0 | 0 | 0 |
| 28.05.2015 23:00 - 24:00 | 0 | 0 | 0 | 0 |
| 29.05.2015 00:00 - 01:00 | 0 | 0 | 0 | 0 |
| 29.05.2015 01:00 - 02:00 | 0 | 0 | 0 | 0 |
| 29.05.2015 02:00 - 03:00 | 0 | 0 | 0 | 0 |
| 29.05.2015 03:00 - 04:00 | 0 | 0 | 0 | 0 |
| 29.05.2015 04:00 - 05:00 | 0 | 0 | 0 | 0 |
| 29.05.2015 05:00 - 06:00 | 0 | 0 | 0 | 0 |
| 29.05.2015 06:00 - 07:00 | 0 | 0 | 0 | 0 |
| 29.05.2015 07:00 - 08:00 | 0 | 0 | 0 | 0 |
| 29.05.2015 08:00 - 09:00 | 0 | 0 | 0 | 0 |
| 29.05.2015 09:00 - 10:00 | 0 | 0 | 0 | 0 |
| 29.05.2015 10:00 - 11:00 | 0 | 0 | 0 | 0 |
| 29.05.2015 11:00 - 12:00 | 0 | 0 | 0 | 0 |
| 29.05.2015 12:00 - 13:00 | 0 | 0 | 0 | 0 |
| 29.05.2015 13:00 - 14:00 | 0 | 0 | 0 | 0 |
| 29.05.2015 14:00 - 15:00 | 0 | 0 | 0 | 0 |
| 29.05.2015 15:00 - 16:00 | 0 | 0 | 0 | 0 |
| 29.05.2015 16:00 - 17:00 | 0 | 0 | 0 | 0 |
| 29.05.2015 17:00 - 18:00 | 0 | 0 | 0 | 0 |
| 29.05.2015 18:00 - 19:00 | 0 | 0 | 0 | 0 |
| 29.05.2015 19:00 - 20:00 | 0 | 0 | 0 | 0 |
| 29.05.2015 20:00 - 21:00 | 0 | 0 | 0 | 0 |
| 29.05.2015 21:00 - 22:00 | 0 | 0 | 0 | 0 |
| 29.05.2015 22:00 - 23:00 | 0 | -100 | 0 | 0 |
| 29.05.2015 23:00 - 24:00 | 0 | -100 | 0 | 0 |
| 30.05.2015 00:00 - 01:00 | 0 | -100 | 0 | 0 |
| 30.05.2015 01:00 - 02:00 | 0 | -100 | 0 | 0 |
| 30.05.2015 02:00 - 03:00 | 0 | -100 | 0 | 0 |
| 30.05.2015 03:00 - 04:00 | 0 | -100 | 0 | 0 |
| 30.05.2015 04:00 - 05:00 | 0 | -100 | 0 | 0 |
| 30.05.2015 05:00 - 06:00 | 0 | -100 | 0 | 0 |
| 30.05.2015 06:00 - 07:00 | 0 | 0 | 0 | 0 |
| 30.05.2015 07:00 - 08:00 | 0 | 0 | 0 | 0 |
| 30.05.2015 08:00 - 09:00 | 0 | 0 | 0 | 0 |
| 30.05.2015 09:00 - 10:00 | 0 | 0 | 0 | 0 |
| 30.05.2015 10:00 - 11:00 | 0 | 0 | 0 | 0 |
| 30.05.2015 11:00 - 12:00 | 0 | 0 | 0 | 0 |
| 30.05.2015 12:00 - 13:00 | 0 | 0 | 0 | 0 |
| 30.05.2015 13:00 - 14:00 | 0 | 0 | 0 | 0 |
| 30.05.2015 14:00 - 15:00 | 0 | 0 | 0 | 0 |
| 30.05.2015 15:00 - 16:00 | 0 | 0 | 0 | 0 |
| 30.05.2015 16:00 - 17:00 | 0 | 0 | 0 | 0 |
| 30.05.2015 17:00 - 18:00 | 0 | -90 | 0 | 0 |
| 30.05.2015 18:00 - 19:00 | 0 | -90 | 0 | 0 |
| 30.05.2015 19:00 - 20:00 | 0 | -90 | 0 | 0 |
| 30.05.2015 20:00 - 21:00 | 0 | -90 | 0 | 0 |
| 30.05.2015 21:00 - 22:00 | 0 | -90 | 0 | 0 |
| 30.05.2015 22:00 - 23:00 | 0 | -90 | 0 | 0 |
| 30.05.2015 23:00 - 24:00 | 0 | -140 | 0 | 0 |
| 31.05.2015 00:00 - 01:00 | 0 | -140 | 0 | 0 |
| 31.05.2015 01:00 - 02:00 | 0 | -140 | 0 | 0 |
| 31.05.2015 02:00 - 03:00 | 0 | -140 | 0 | 0 |
| 31.05.2015 03:00 - 04:00 | 0 | -140 | 0 | 0 |